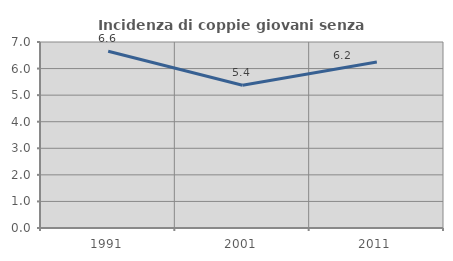
| Category | Incidenza di coppie giovani senza figli |
|---|---|
| 1991.0 | 6.649 |
| 2001.0 | 5.374 |
| 2011.0 | 6.244 |